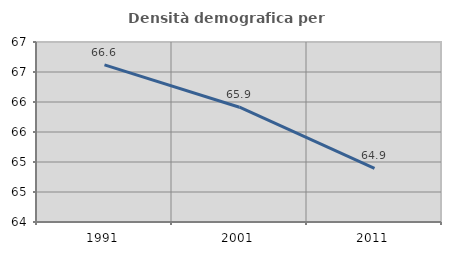
| Category | Densità demografica |
|---|---|
| 1991.0 | 66.618 |
| 2001.0 | 65.913 |
| 2011.0 | 64.895 |